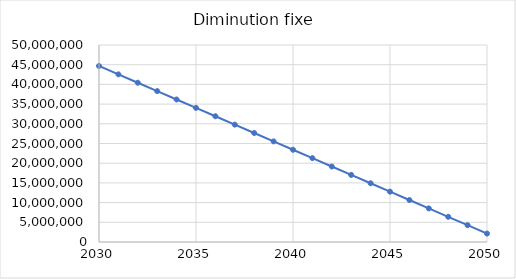
| Category | Diminution fixe |
|---|---|
| 2030.0 | 44677380 |
| 2031.0 | 42550651 |
| 2032.0 | 40423922 |
| 2033.0 | 38297193 |
| 2034.0 | 36170464 |
| 2035.0 | 34043735 |
| 2036.0 | 31917006 |
| 2037.0 | 29790277 |
| 2038.0 | 27663548 |
| 2039.0 | 25536819 |
| 2040.0 | 23410090 |
| 2041.0 | 21283361 |
| 2042.0 | 19156632 |
| 2043.0 | 17029903 |
| 2044.0 | 14903174 |
| 2045.0 | 12776445 |
| 2046.0 | 10649716 |
| 2047.0 | 8522987 |
| 2048.0 | 6396258 |
| 2049.0 | 4269529 |
| 2050.0 | 2142800 |